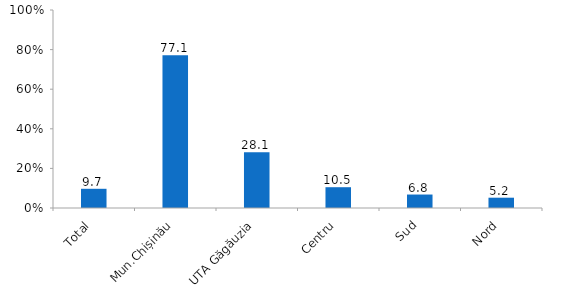
| Category | Series 0 |
|---|---|
| Total | 9.7 |
| Mun.Chișinău | 77.1 |
| UTA Găgăuzia | 28.1 |
| Centru | 10.5 |
| Sud | 6.8 |
| Nord | 5.2 |